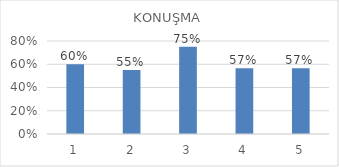
| Category | Series 0 |
|---|---|
| 0 | 0.6 |
| 1 | 0.55 |
| 2 | 0.75 |
| 3 | 0.567 |
| 4 | 0.567 |